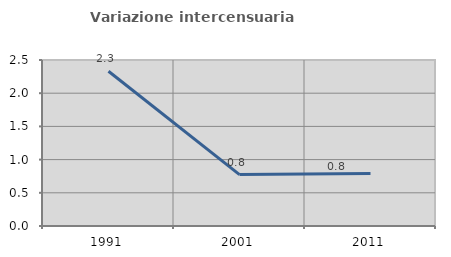
| Category | Variazione intercensuaria annua |
|---|---|
| 1991.0 | 2.33 |
| 2001.0 | 0.774 |
| 2011.0 | 0.791 |